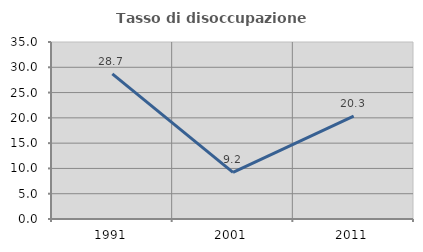
| Category | Tasso di disoccupazione giovanile  |
|---|---|
| 1991.0 | 28.689 |
| 2001.0 | 9.211 |
| 2011.0 | 20.339 |